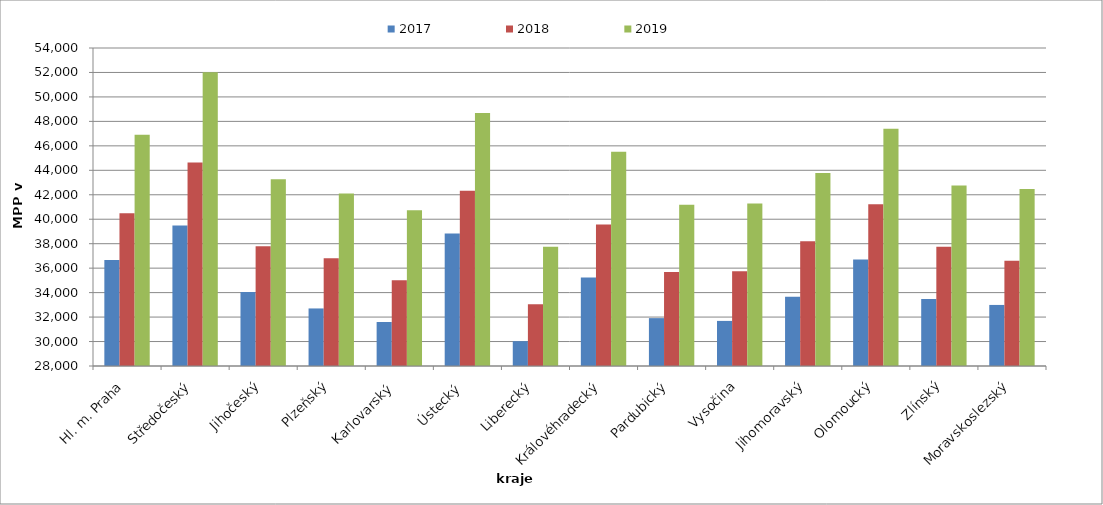
| Category | 2017 | 2018 | 2019 |
|---|---|---|---|
| Hl. m. Praha | 36666.288 | 40483.698 | 46897.905 |
| Středočeský | 39494.862 | 44628.235 | 52012.18 |
| Jihočeský | 34041.477 | 37786.569 | 43265.103 |
| Plzeňský | 32705.435 | 36805.525 | 42099.448 |
| Karlovarský  | 31596.33 | 35009.174 | 40733.945 |
| Ústecký   | 38843.035 | 42338.392 | 48689.015 |
| Liberecký | 30029.528 | 33052.507 | 37744.323 |
| Královéhradecký | 35236.043 | 39577.669 | 45514.202 |
| Pardubický | 31913.837 | 35676.662 | 41185.001 |
| Vysočina | 31686.655 | 35742.471 | 41283.052 |
| Jihomoravský | 33652.273 | 38190.909 | 43772.727 |
| Olomoucký | 36705.609 | 41220.116 | 47403.482 |
| Zlínský | 33475.981 | 37758.241 | 42760.641 |
| Moravskoslezský | 32992.516 | 36608.861 | 42462.885 |